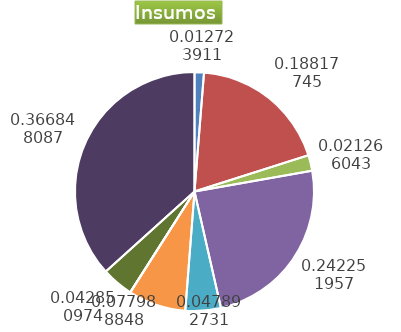
| Category | Series 0 |
|---|---|
| Control arvenses | 1111222 |
| Control fitosanitario | 16434171 |
| Cosecha y beneficio | 1857235.176 |
| Fertilización | 21156680 |
| Instalación | 4182633.61 |
| Otros | 6811029 |
| Podas | 0 |
| Riego | 0 |
| Transporte | 3742320 |
| Tutorado | 32038080 |